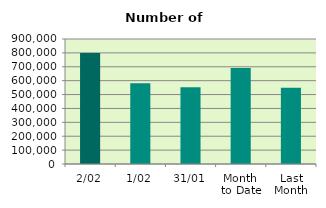
| Category | Series 0 |
|---|---|
| 2/02 | 799234 |
| 1/02 | 581562 |
| 31/01 | 553230 |
| Month 
to Date | 690398 |
| Last
Month | 549126.273 |